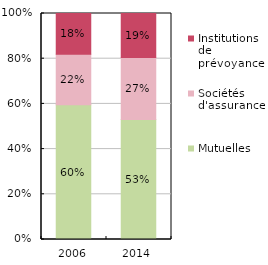
| Category | Mutuelles | Sociétés d'assurance | Institutions de prévoyance |
|---|---|---|---|
| 2006.0 | 0.596 | 0.224 | 0.18 |
| 2014.0 | 0.531 | 0.274 | 0.194 |